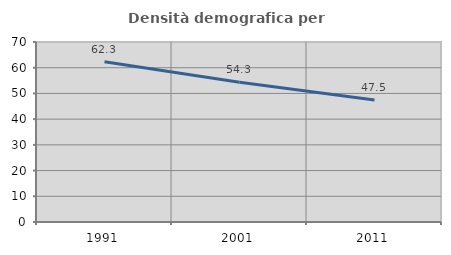
| Category | Densità demografica |
|---|---|
| 1991.0 | 62.332 |
| 2001.0 | 54.321 |
| 2011.0 | 47.453 |